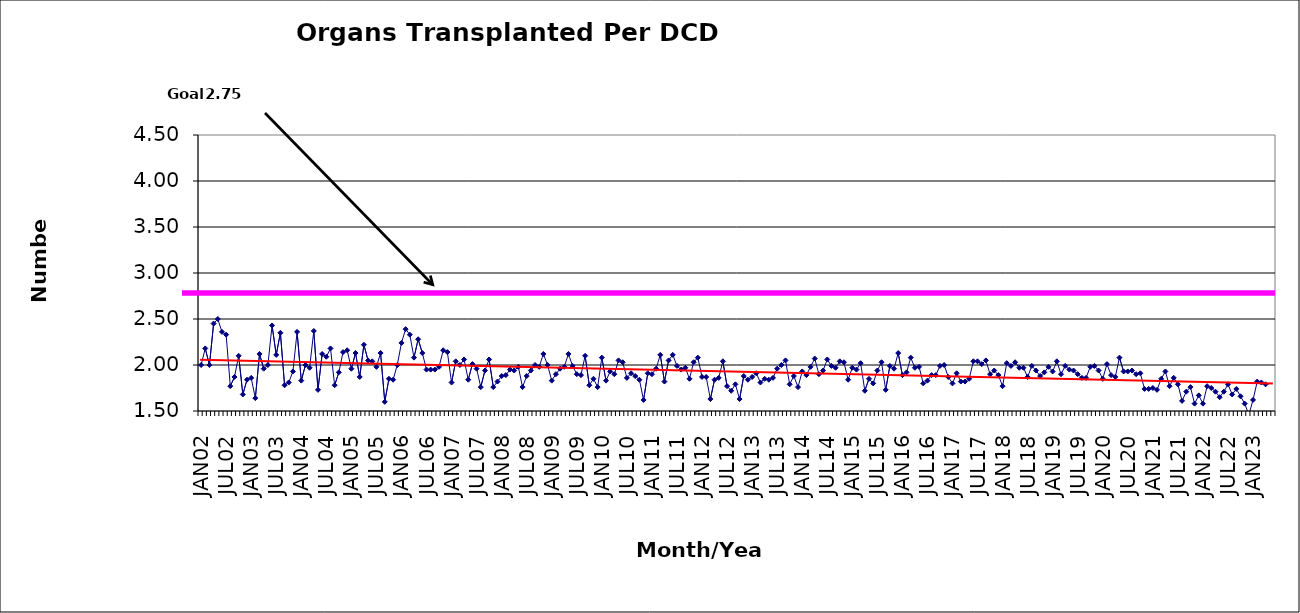
| Category | Series 0 |
|---|---|
| JAN02 | 2 |
| FEB02 | 2.18 |
| MAR02 | 2 |
| APR02 | 2.45 |
| MAY02 | 2.5 |
| JUN02 | 2.36 |
| JUL02 | 2.33 |
| AUG02 | 1.77 |
| SEP02 | 1.87 |
| OCT02 | 2.1 |
| NOV02 | 1.68 |
| DEC02 | 1.84 |
| JAN03 | 1.86 |
| FEB03 | 1.64 |
| MAR03 | 2.12 |
| APR03 | 1.96 |
| MAY03 | 2 |
| JUN03 | 2.43 |
| JUL03 | 2.11 |
| AUG03 | 2.35 |
| SEP03 | 1.78 |
| OCT03 | 1.81 |
| NOV03 | 1.93 |
| DEC03 | 2.36 |
| JAN04 | 1.83 |
| FEB04 | 2 |
| MAR04 | 1.97 |
| APR04 | 2.37 |
| MAY04 | 1.73 |
| JUN04 | 2.12 |
| JUL04 | 2.09 |
| AUG04 | 2.18 |
| SEP04 | 1.78 |
| OCT04 | 1.92 |
| NOV04 | 2.14 |
| DEC04 | 2.16 |
| JAN05 | 1.96 |
| FEB05 | 2.13 |
| MAR05 | 1.87 |
| APR05 | 2.22 |
| MAY05 | 2.05 |
| JUN05 | 2.04 |
| JUL05 | 1.98 |
| AUG05 | 2.13 |
| SEP05 | 1.6 |
| OCT05 | 1.85 |
| NOV05 | 1.84 |
| DEC05 | 2 |
| JAN06 | 2.24 |
| FEB06 | 2.39 |
| MAR06 | 2.33 |
| APR06 | 2.08 |
| MAY06 | 2.28 |
| JUN06 | 2.13 |
| JUL06 | 1.95 |
| AUG06 | 1.95 |
| SEP06 | 1.95 |
| OCT06 | 1.98 |
| NOV06 | 2.16 |
| DEC06 | 2.14 |
| JAN07 | 1.81 |
| FEB07 | 2.04 |
| MAR07 | 2 |
| APR07 | 2.06 |
| MAY07 | 1.84 |
| JUN07 | 2.01 |
| JUL07 | 1.96 |
| AUG07 | 1.76 |
| SEP07 | 1.94 |
| OCT07 | 2.06 |
| NOV07 | 1.76 |
| DEC07 | 1.82 |
| JAN08 | 1.88 |
| FEB08 | 1.89 |
| MAR08 | 1.95 |
| APR08 | 1.94 |
| MAY08 | 1.98 |
| JUN08 | 1.76 |
| JUL08 | 1.88 |
| AUG08 | 1.94 |
| SEP08 | 2 |
| OCT08 | 1.98 |
| NOV08 | 2.12 |
| DEC08 | 2 |
| JAN09 | 1.83 |
| FEB09 | 1.9 |
| MAR09 | 1.96 |
| APR09 | 1.98 |
| MAY09 | 2.12 |
| JUN09 | 1.99 |
| JUL09 | 1.9 |
| AUG09 | 1.89 |
| SEP09 | 2.1 |
| OCT09 | 1.78 |
| NOV09 | 1.85 |
| DEC09 | 1.76 |
| JAN10 | 2.08 |
| FEB10 | 1.83 |
| MAR10 | 1.93 |
| APR10 | 1.9 |
| MAY10 | 2.05 |
| JUN10 | 2.03 |
| JUL10 | 1.86 |
| AUG10 | 1.91 |
| SEP10 | 1.88 |
| OCT10 | 1.84 |
| NOV10 | 1.62 |
| DEC10 | 1.91 |
| JAN11 | 1.9 |
| FEB11 | 1.96 |
| MAR11 | 2.11 |
| APR11 | 1.82 |
| MAY11 | 2.05 |
| JUN11 | 2.11 |
| JUL11 | 1.99 |
| AUG11 | 1.95 |
| SEP11 | 1.97 |
| OCT11 | 1.85 |
| NOV11 | 2.03 |
| DEC11 | 2.08 |
| JAN12 | 1.87 |
| FEB12 | 1.87 |
| MAR12 | 1.63 |
| APR12 | 1.84 |
| MAY12 | 1.86 |
| JUN12 | 2.04 |
| JUL12 | 1.77 |
| AUG12 | 1.72 |
| SEP12 | 1.79 |
| OCT12 | 1.63 |
| NOV12 | 1.88 |
| DEC12 | 1.84 |
| JAN13 | 1.87 |
| FEB13 | 1.91 |
| MAR13 | 1.81 |
| APR13 | 1.85 |
| MAY13 | 1.84 |
| JUN13 | 1.86 |
| JUL13 | 1.96 |
| AUG13 | 2 |
| SEP13 | 2.05 |
| OCT13 | 1.79 |
| NOV13 | 1.88 |
| DEC13 | 1.76 |
| JAN14 | 1.93 |
| FEB14 | 1.89 |
| MAR14 | 1.98 |
| APR14 | 2.07 |
| MAY14 | 1.9 |
| JUN14 | 1.94 |
| JUL14 | 2.06 |
| AUG14 | 1.99 |
| SEP14 | 1.97 |
| OCT14 | 2.04 |
| NOV14 | 2.03 |
| DEC14 | 1.84 |
| JAN15 | 1.97 |
| FEB15 | 1.95 |
| MAR15 | 2.02 |
| APR15 | 1.72 |
| MAY15 | 1.85 |
| JUN15 | 1.8 |
| JUL15 | 1.94 |
| AUG15 | 2.03 |
| SEP15 | 1.73 |
| OCT15 | 1.99 |
| NOV15 | 1.96 |
| DEC15 | 2.13 |
| JAN16 | 1.89 |
| FEB16 | 1.92 |
| MAR16 | 2.08 |
| APR16 | 1.97 |
| MAY16 | 1.98 |
| JUN16 | 1.8 |
| JUL16 | 1.83 |
| AUG16 | 1.89 |
| SEP16 | 1.89 |
| OCT16 | 1.99 |
| NOV16 | 2 |
| DEC16 | 1.87 |
| JAN17 | 1.8 |
| FEB17 | 1.91 |
| MAR17 | 1.82 |
| APR17 | 1.82 |
| MAY17 | 1.85 |
| JUN17 | 2.04 |
| JUL17 | 2.04 |
| AUG17 | 2.01 |
| SEP17 | 2.05 |
| OCT17 | 1.9 |
| NOV17 | 1.94 |
| DEC17 | 1.89 |
| JAN18 | 1.77 |
| FEB18 | 2.02 |
| MAR18 | 1.99 |
| APR18 | 2.03 |
| MAY18 | 1.97 |
| JUN18 | 1.97 |
| JUL18 | 1.87 |
| AUG18 | 1.99 |
| SEP18 | 1.94 |
| OCT18 | 1.88 |
| NOV18 | 1.92 |
| DEC18 | 1.98 |
| JAN19 | 1.93 |
| FEB19 | 2.04 |
| MAR19 | 1.9 |
| APR19 | 1.99 |
| MAY19 | 1.95 |
| JUN19 | 1.94 |
| JUL19 | 1.9 |
| AUG19 | 1.86 |
| SEP19 | 1.86 |
| OCT19 | 1.98 |
| NOV19 | 1.99 |
| DEC19 | 1.94 |
| JAN20 | 1.85 |
| FEB20 | 2.01 |
| MAR20 | 1.89 |
| APR20 | 1.87 |
| MAY20 | 2.08 |
| JUN20 | 1.93 |
| JUL20 | 1.93 |
| AUG20 | 1.94 |
| SEP20 | 1.9 |
| OCT20 | 1.91 |
| NOV20 | 1.74 |
| DEC20 | 1.74 |
| JAN21 | 1.75 |
| FEB21 | 1.73 |
| MAR21 | 1.85 |
| APR21 | 1.93 |
| MAY21 | 1.77 |
| JUN21 | 1.86 |
| JUL21 | 1.79 |
| AUG21 | 1.61 |
| SEP21 | 1.71 |
| OCT21 | 1.76 |
| NOV21 | 1.58 |
| DEC21 | 1.67 |
| JAN22 | 1.58 |
| FEB22 | 1.77 |
| MAR22 | 1.75 |
| APR22 | 1.71 |
| MAY22 | 1.65 |
| JUN22 | 1.71 |
| JUL22 | 1.79 |
| AUG22 | 1.68 |
| SEP22 | 1.74 |
| OCT22 | 1.66 |
| NOV22 | 1.58 |
| DEC22 | 1.46 |
| JAN23 | 1.62 |
| FEB23 | 1.82 |
| MAR23 | 1.81 |
| APR23 | 1.79 |